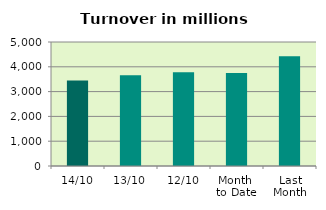
| Category | Series 0 |
|---|---|
| 14/10 | 3445.583 |
| 13/10 | 3661.235 |
| 12/10 | 3776.302 |
| Month 
to Date | 3753.011 |
| Last
Month | 4425.778 |